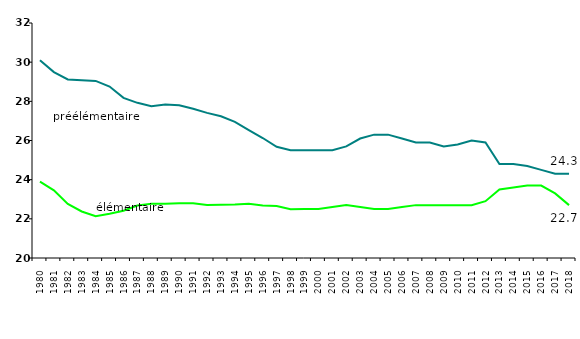
| Category | Cl. matern. | CP-CM2 |
|---|---|---|
| 1980.0 | 30.1 | 23.9 |
| 1981.0 | 29.494 | 23.452 |
| 1982.0 | 29.12 | 22.76 |
| 1983.0 | 29.079 | 22.375 |
| 1984.0 | 29.042 | 22.135 |
| 1985.0 | 28.754 | 22.255 |
| 1986.0 | 28.176 | 22.414 |
| 1987.0 | 27.924 | 22.68 |
| 1988.0 | 27.75 | 22.773 |
| 1989.0 | 27.836 | 22.773 |
| 1990.0 | 27.8 | 22.8 |
| 1991.0 | 27.618 | 22.796 |
| 1992.0 | 27.411 | 22.712 |
| 1993.0 | 27.238 | 22.722 |
| 1994.0 | 26.951 | 22.732 |
| 1995.0 | 26.535 | 22.766 |
| 1996.0 | 26.127 | 22.681 |
| 1997.0 | 25.677 | 22.657 |
| 1998.0 | 25.506 | 22.49 |
| 1999.0 | 25.5 | 22.5 |
| 2000.0 | 25.5 | 22.5 |
| 2001.0 | 25.5 | 22.6 |
| 2002.0 | 25.7 | 22.7 |
| 2003.0 | 26.1 | 22.6 |
| 2004.0 | 26.3 | 22.5 |
| 2005.0 | 26.3 | 22.5 |
| 2006.0 | 26.1 | 22.6 |
| 2007.0 | 25.9 | 22.7 |
| 2008.0 | 25.9 | 22.7 |
| 2009.0 | 25.7 | 22.7 |
| 2010.0 | 25.8 | 22.7 |
| 2011.0 | 26 | 22.7 |
| 2012.0 | 25.9 | 22.9 |
| 2013.0 | 24.8 | 23.5 |
| 2014.0 | 24.8 | 23.6 |
| 2015.0 | 24.7 | 23.7 |
| 2016.0 | 24.5 | 23.7 |
| 2017.0 | 24.3 | 23.3 |
| 2018.0 | 24.3 | 22.7 |